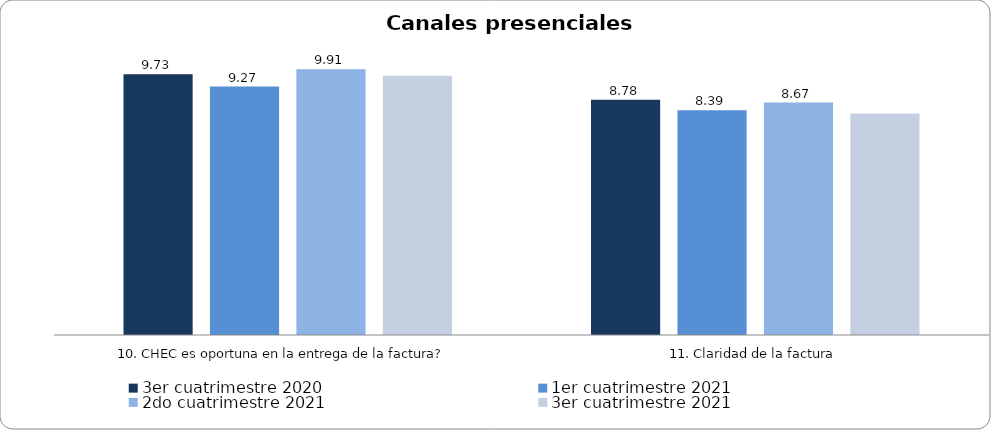
| Category | 3er cuatrimestre 2020 | Septiembre - Octubre 2018 | 1er cuatrimestre 2021 | Noviembre - Diciembre 2018 | 1er cuatrimestre 2019 | 2do cuatrimestre 2019 | 2do cuatrimestre 2021 | 3er cuatrimestre 2021 |
|---|---|---|---|---|---|---|---|---|
| 10. CHEC es oportuna en la entrega de la factura? | 9.726 |  | 9.271 |  |  |  | 9.914 | 9.672 |
| 11. Claridad de la factura | 8.776 |  | 8.385 |  |  |  | 8.672 | 8.262 |